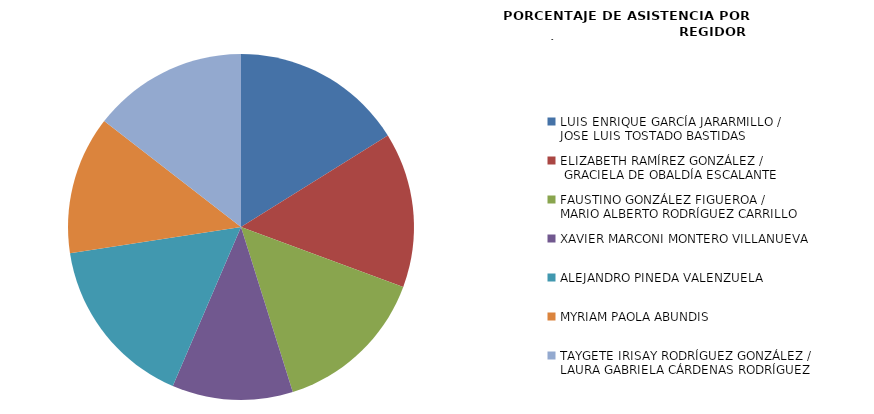
| Category | Series 0 |
|---|---|
| LUIS ENRIQUE GARCÍA JARARMILLO / 
JOSE LUIS TOSTADO BASTIDAS | 100 |
| ELIZABETH RAMÍREZ GONZÁLEZ /
 GRACIELA DE OBALDÍA ESCALANTE | 90 |
| FAUSTINO GONZÁLEZ FIGUEROA / 
MARIO ALBERTO RODRÍGUEZ CARRILLO | 90 |
| XAVIER MARCONI MONTERO VILLANUEVA | 70 |
| ALEJANDRO PINEDA VALENZUELA | 100 |
| MYRIAM PAOLA ABUNDIS | 80 |
| TAYGETE IRISAY RODRÍGUEZ GONZÁLEZ /
LAURA GABRIELA CÁRDENAS RODRÍGUEZ | 90 |